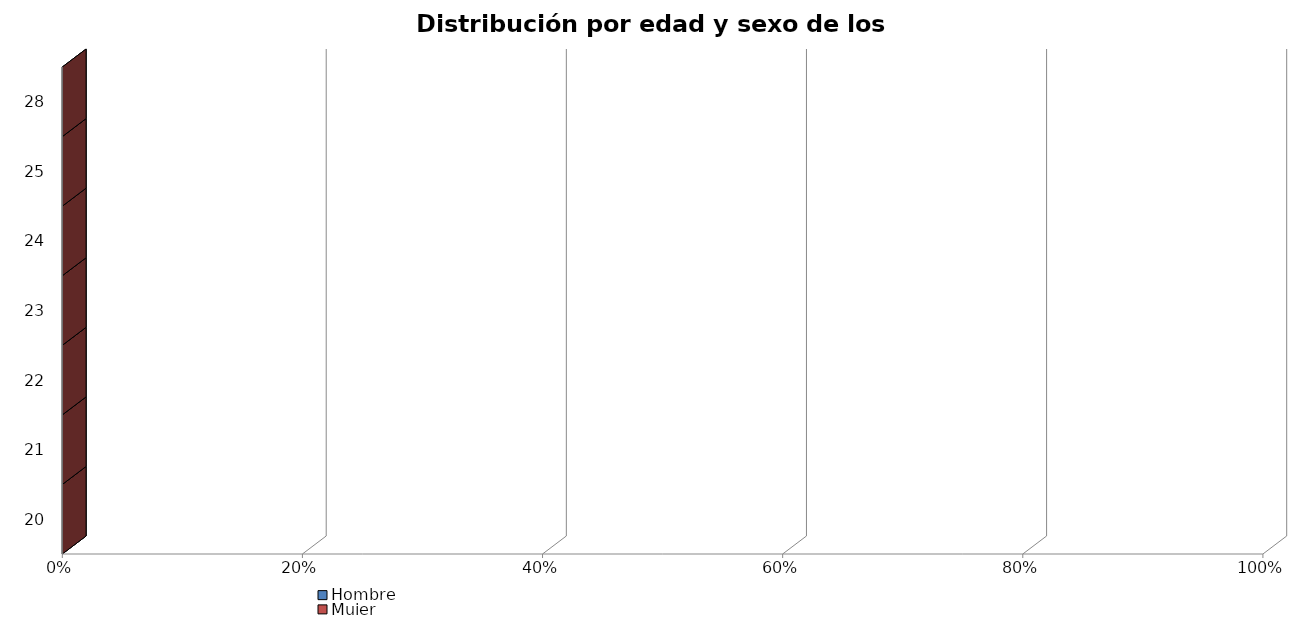
| Category | Hombre | Mujer |
|---|---|---|
| 20 | 0 | 0 |
| 21 | 0 | 0 |
| 22 | 0 | 0 |
| 23 | 0 | 0 |
| 24 | 0 | 0 |
| 25 | 0 | 0 |
| 28 | 0 | 0 |